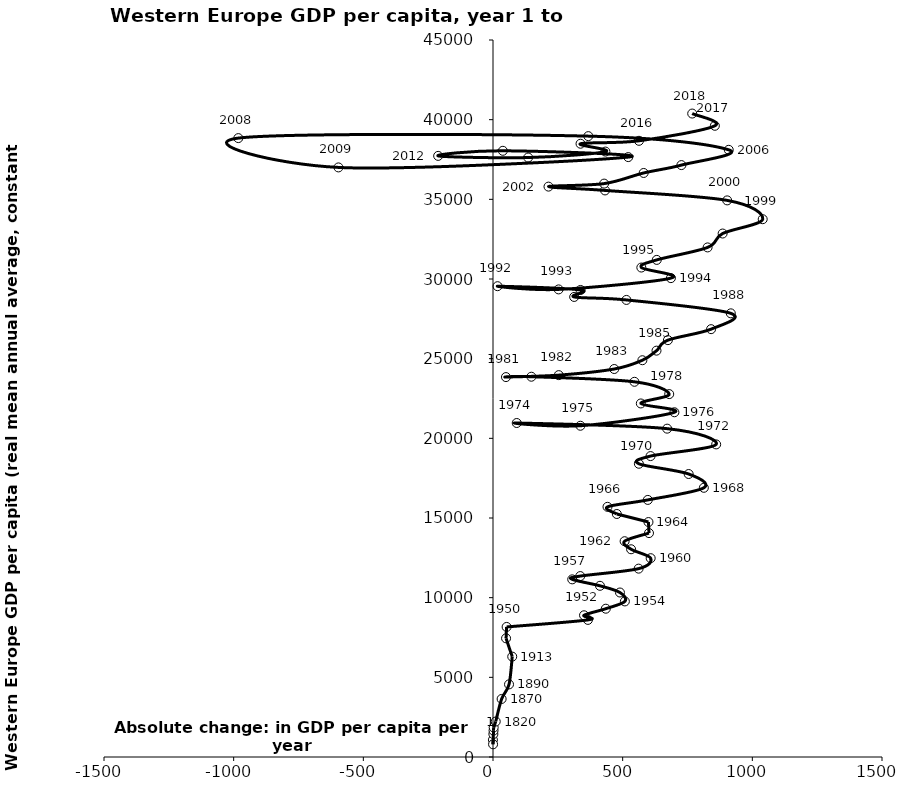
| Category | Series 0 |
|---|---|
| -0.27772175486429596 | 1074.708 |
| 0.24255499537643682 | 797.264 |
| 1.4315368125758325 | 1438.298 |
| 2.073836486802654 | 1656.186 |
| 2.596776046578191 | 1853.066 |
| 10.529025505314864 | 2227.477 |
| 33.27889695214381 | 3643 |
| 61.7906976744186 | 4557 |
| 74.15384615384616 | 6300 |
| 50.351351351351354 | 7449 |
| 52.54545454545455 | 8163 |
| 366.0 | 8605 |
| 351.0 | 8895 |
| 435.0 | 9307 |
| 508.5 | 9765 |
| 489.5 | 10324 |
| 412.5 | 10744 |
| 305.5 | 11149 |
| 336.5 | 11355 |
| 561.5 | 11822 |
| 608.0 | 12478 |
| 532.5 | 13038 |
| 507.5 | 13543 |
| 601.5 | 14053 |
| 599.5 | 14746 |
| 477.5 | 15252 |
| 441.5 | 15701 |
| 597.0 | 16135 |
| 813.0 | 16895 |
| 754.5 | 17761 |
| 562.5 | 18404 |
| 607.5 | 18886 |
| 860.5 | 19619 |
| 671.5 | 20607 |
| 91.5 | 20962 |
| 337.0 | 20790 |
| 699.5 | 21636 |
| 570.0 | 22189 |
| 679.5 | 22776 |
| 545.5 | 23548 |
| 148.0 | 23867 |
| 50.0 | 23844 |
| 253.5 | 23967 |
| 467.5 | 24351 |
| 576.0 | 24902 |
| 630.5 | 25503 |
| 674.5 | 26163 |
| 841.0 | 26852 |
| 917.0 | 27845 |
| 514.5 | 28686 |
| 313.0 | 28874 |
| 337.5 | 29312 |
| 17.5 | 29549 |
| 253.0 | 29347 |
| 686.0 | 30055 |
| 572.0 | 30719 |
| 631.5 | 31199 |
| 827.5 | 31982 |
| 885.5 | 32854 |
| 1040.0 | 33753 |
| 903.0 | 34934 |
| 432.0 | 35559 |
| 214.0 | 35798 |
| 428.5 | 35987 |
| 581.0 | 36655 |
| 726.5 | 37149 |
| 909.0 | 38108 |
| 367.5 | 38967 |
| -982.0 | 38843 |
| -596.0 | 37003 |
| 521.5 | 37651 |
| 38.0 | 38046 |
| -211.5 | 37727 |
| 135.5 | 37623 |
| 433.5 | 37998 |
| 337.5 | 38490 |
| 562.8935461764013 | 38673 |
| 855.4506788385443 | 39615.787 |
| 768.114265324286 | 40383.901 |